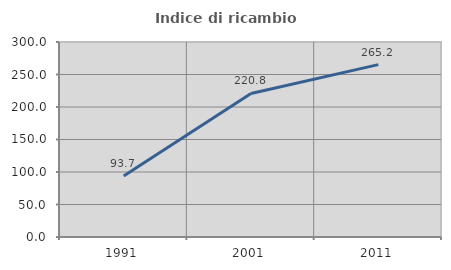
| Category | Indice di ricambio occupazionale  |
|---|---|
| 1991.0 | 93.675 |
| 2001.0 | 220.805 |
| 2011.0 | 265.196 |